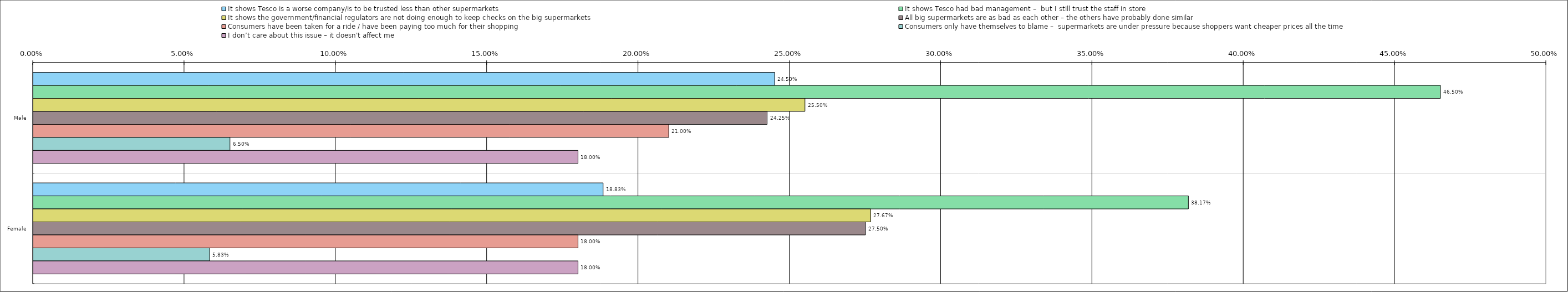
| Category | It shows Tesco is a worse company/is to be trusted less than other supermarkets | It shows Tesco had bad management –  but I still trust the staff in store | It shows the government/financial regulators are not doing enough to keep checks on the big supermarkets | All big supermarkets are as bad as each other – the others have probably done similar | Consumers have been taken for a ride / have been paying too much for their shopping | Consumers only have themselves to blame –  supermarkets are under pressure because shoppers want cheaper prices all the time | I don’t care about this issue – it doesn't affect me |
|---|---|---|---|---|---|---|---|
| 0 | 0.245 | 0.465 | 0.255 | 0.242 | 0.21 | 0.065 | 0.18 |
| 1 | 0.188 | 0.382 | 0.277 | 0.275 | 0.18 | 0.058 | 0.18 |